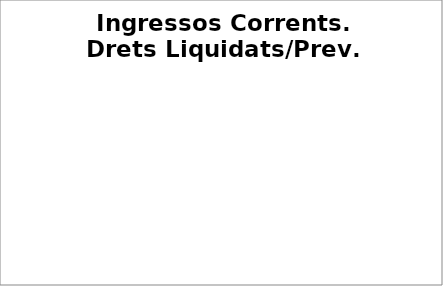
| Category | Series 0 |
|---|---|
| Impostos locals | 0.033 |
| Participació Tributs de l'Estat | 0.081 |
| Taxes i altres ingressos | 0.021 |
| Transferències corrents (exc. FCF) | 0.004 |
| Ingressos patrimonials | 0.031 |
| Ingressos corrents | 0.052 |